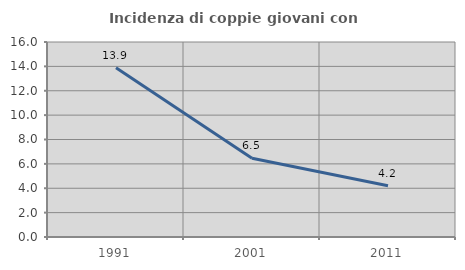
| Category | Incidenza di coppie giovani con figli |
|---|---|
| 1991.0 | 13.889 |
| 2001.0 | 6.467 |
| 2011.0 | 4.204 |